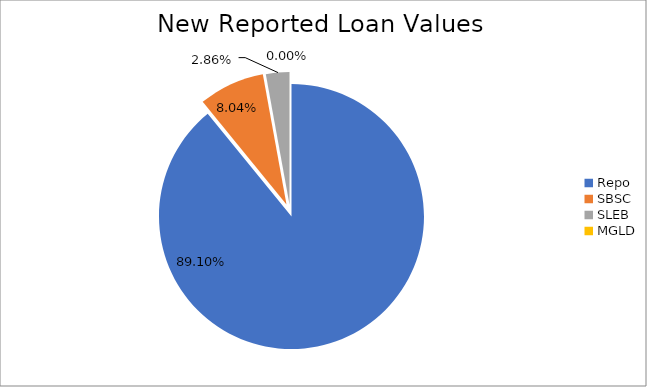
| Category | Series 0 |
|---|---|
| Repo | 11694911.047 |
| SBSC | 1054971.573 |
| SLEB | 375212.494 |
| MGLD | 94.651 |